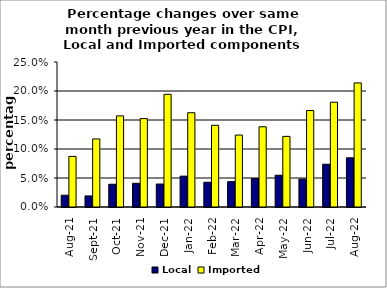
| Category | Local | Imported |
|---|---|---|
| 2021-08-01 | 0.02 | 0.087 |
| 2021-09-01 | 0.019 | 0.117 |
| 2021-10-01 | 0.039 | 0.157 |
| 2021-11-01 | 0.041 | 0.152 |
| 2021-12-01 | 0.04 | 0.194 |
| 2022-01-01 | 0.053 | 0.163 |
| 2022-02-01 | 0.043 | 0.141 |
| 2022-03-01 | 0.044 | 0.124 |
| 2022-04-01 | 0.049 | 0.138 |
| 2022-05-01 | 0.055 | 0.122 |
| 2022-06-01 | 0.048 | 0.166 |
| 2022-07-01 | 0.074 | 0.181 |
| 2022-08-01 | 0.085 | 0.214 |